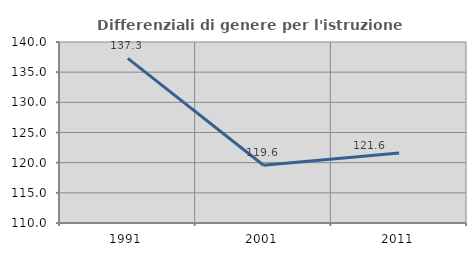
| Category | Differenziali di genere per l'istruzione superiore |
|---|---|
| 1991.0 | 137.29 |
| 2001.0 | 119.575 |
| 2011.0 | 121.612 |